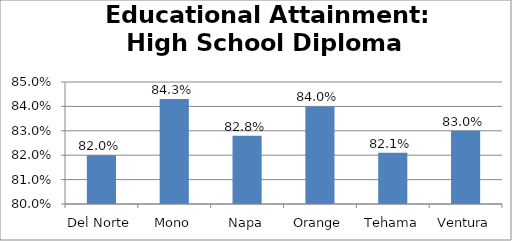
| Category | Series 0 |
|---|---|
| Del Norte | 0.82 |
| Mono | 0.843 |
| Napa | 0.828 |
| Orange | 0.84 |
| Tehama | 0.821 |
| Ventura | 0.83 |